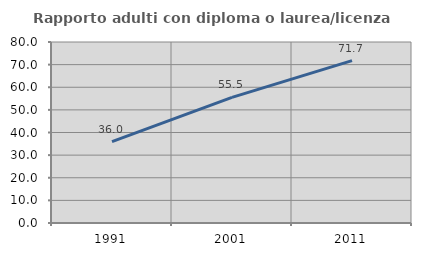
| Category | Rapporto adulti con diploma o laurea/licenza media  |
|---|---|
| 1991.0 | 36 |
| 2001.0 | 55.508 |
| 2011.0 | 71.739 |